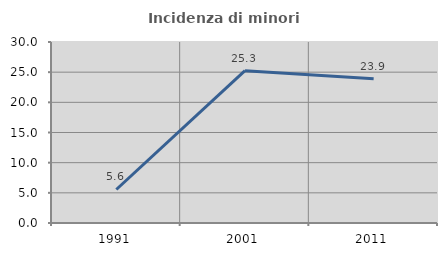
| Category | Incidenza di minori stranieri |
|---|---|
| 1991.0 | 5.556 |
| 2001.0 | 25.253 |
| 2011.0 | 23.901 |